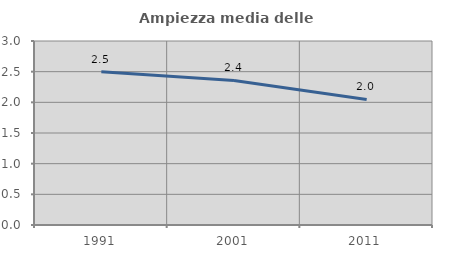
| Category | Ampiezza media delle famiglie |
|---|---|
| 1991.0 | 2.497 |
| 2001.0 | 2.358 |
| 2011.0 | 2.046 |